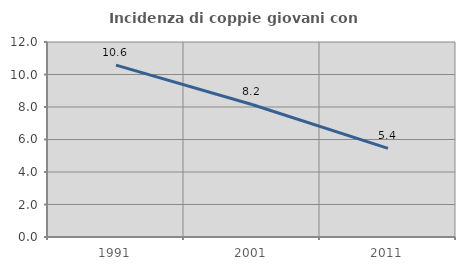
| Category | Incidenza di coppie giovani con figli |
|---|---|
| 1991.0 | 10.58 |
| 2001.0 | 8.155 |
| 2011.0 | 5.45 |